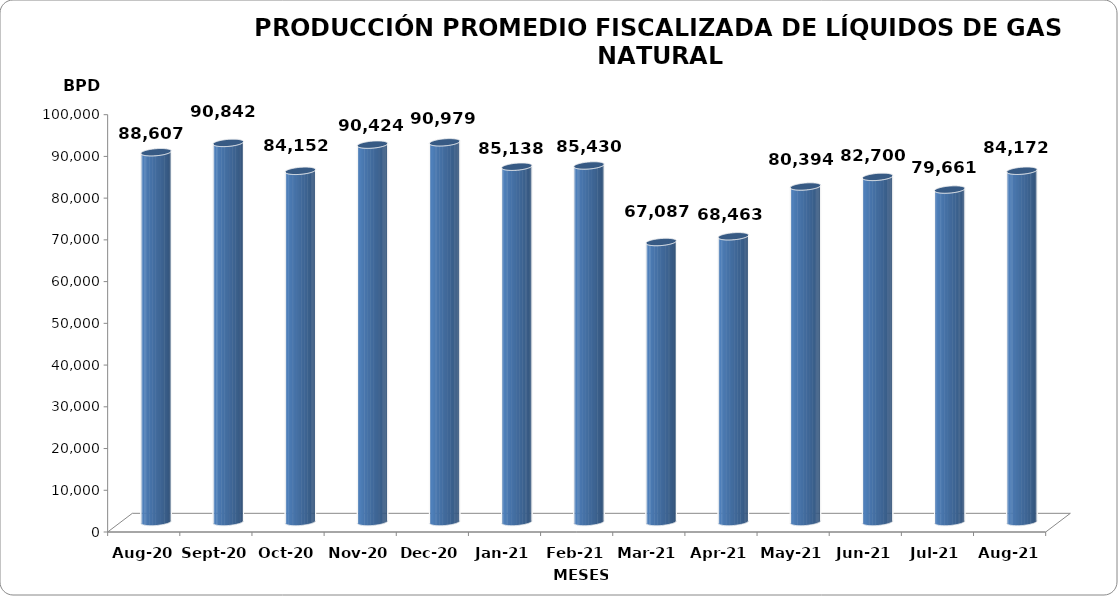
| Category | Series 0 |
|---|---|
| 2020-08-01 | 88607 |
| 2020-09-01 | 90842 |
| 2020-10-01 | 84152 |
| 2020-11-01 | 90424 |
| 2020-12-01 | 90979 |
| 2021-01-01 | 85138 |
| 2021-02-01 | 85430 |
| 2021-03-01 | 67087 |
| 2021-04-01 | 68463 |
| 2021-05-01 | 80393.645 |
| 2021-06-01 | 82699.833 |
| 2021-07-01 | 79661.29 |
| 2021-08-01 | 84171.548 |